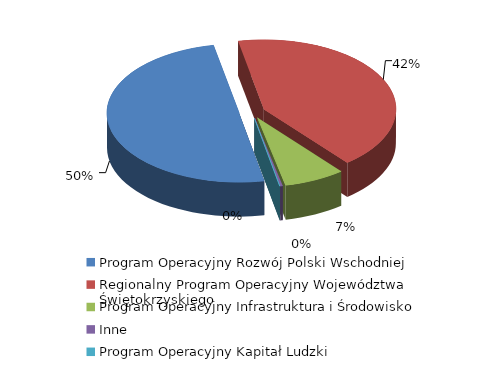
| Category | Series 0 |
|---|---|
| Program Operacyjny Rozwój Polski Wschodniej | 62923306.32 |
| Regionalny Program Operacyjny Województwa Świętokrzyskiego | 53196942.12 |
| Program Operacyjny Infrastruktura i Środowisko | 9433648.57 |
| Inne | 381038.87 |
| Program Operacyjny Kapitał Ludzki | 62592.38 |